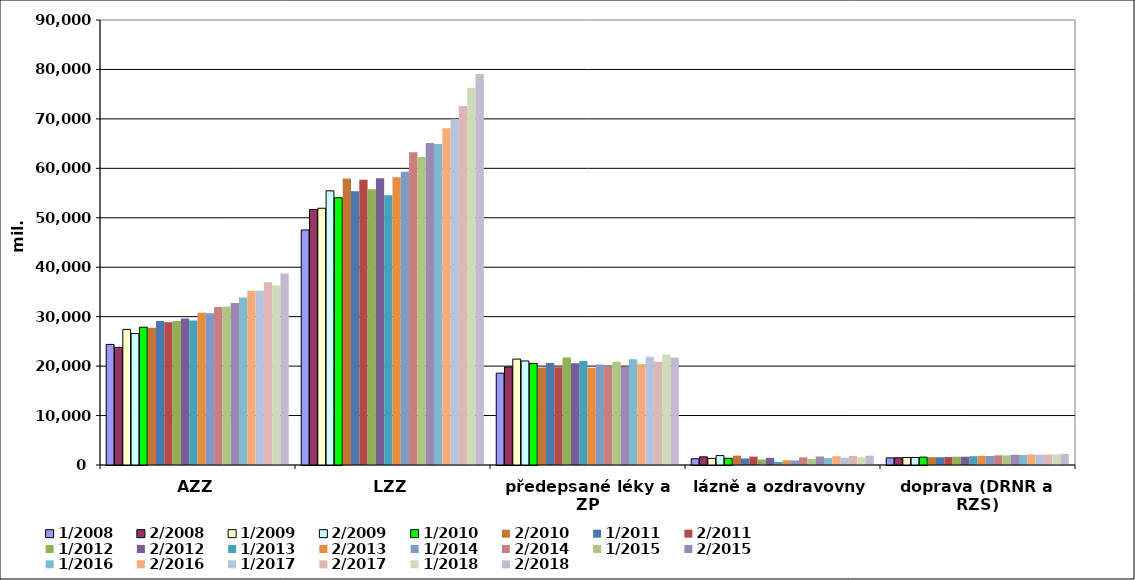
| Category | 1/2008 | 2/2008 | 1/2009 | 2/2009 | 1/2010 | 2/2010 | 1/2011 | 2/2011 | 1/2012 | 2/2012 | 1/2013 | 2/2013 | 1/2014 | 2/2014 | 1/2015 | 2/2015 | 1/2016 | 2/2016 | 1/2017 | 2/2017 | 1/2018 | 2/2018 |
|---|---|---|---|---|---|---|---|---|---|---|---|---|---|---|---|---|---|---|---|---|---|---|
| AZZ | 24388577.454 | 23787285.546 | 27430617 | 26602675 | 27871500 | 27777562 | 29145340 | 28864765 | 29109635 | 29651099 | 29249640 | 30809329 | 30709007 | 31944930 | 32067009 | 32764587 | 33857058 | 35241812 | 35248304 | 36968369 | 36350988.078 | 38737960.255 |
| LZZ | 47531304.53 | 51677763.47 | 51925820 | 55450974 | 54044390 | 57958096 | 55374535 | 57666178 | 55767166 | 57998535 | 54559665 | 58182293 | 59314076 | 63235089 | 62309242 | 65142346 | 64932393 | 68097001 | 69913591 | 72596147 | 76294005.393 | 79102106.582 |
| předepsané léky a ZP | 18574492 | 19823692 | 21419067 | 21042091 | 20553087 | 19728582 | 20648463 | 19781687 | 21765700 | 20556526 | 21010942 | 19680838 | 20322326 | 19974566 | 20868586 | 19820450 | 21362604 | 20442441 | 21868443 | 20902917 | 22360984.206 | 21730926.086 |
| lázně a ozdravovny | 1251453.092 | 1648928.908 | 1330552 | 1903050 | 1352659 | 1893781 | 1319971 | 1693140 | 1105386 | 1440711 | 648759 | 951245 | 919196 | 1554375 | 1199102 | 1712099 | 1418872 | 1784933 | 1479220 | 1838547 | 1534186.157 | 1884893.323 |
| doprava (DRNR a RZS) | 1440950.084 | 1460563.916 | 1514502 | 1513422 | 1591386 | 1584300 | 1569905 | 1629638 | 1678403 | 1677205 | 1783196 | 1862407 | 1821653 | 1953149 | 1937407 | 2073171 | 2017531 | 2127124 | 2100480 | 2118001 | 2156335.217 | 2231840.153 |